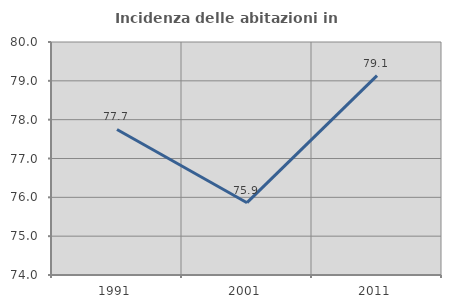
| Category | Incidenza delle abitazioni in proprietà  |
|---|---|
| 1991.0 | 77.748 |
| 2001.0 | 75.862 |
| 2011.0 | 79.134 |